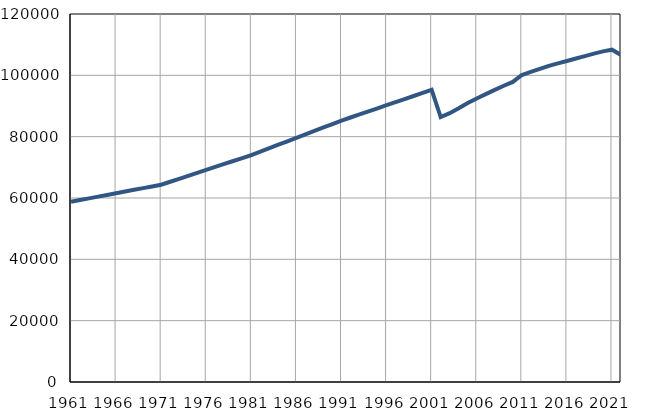
| Category | Population
size |
|---|---|
| 1961.0 | 58777 |
| 1962.0 | 59332 |
| 1963.0 | 59887 |
| 1964.0 | 60442 |
| 1965.0 | 60997 |
| 1966.0 | 61552 |
| 1967.0 | 62106 |
| 1968.0 | 62661 |
| 1969.0 | 63216 |
| 1970.0 | 63771 |
| 1971.0 | 64326 |
| 1972.0 | 65293 |
| 1973.0 | 66261 |
| 1974.0 | 67228 |
| 1975.0 | 68196 |
| 1976.0 | 69163 |
| 1977.0 | 70130 |
| 1978.0 | 71098 |
| 1979.0 | 72065 |
| 1980.0 | 73033 |
| 1981.0 | 74000 |
| 1982.0 | 75125 |
| 1983.0 | 76251 |
| 1984.0 | 77375 |
| 1985.0 | 78500 |
| 1986.0 | 79625 |
| 1987.0 | 80749 |
| 1988.0 | 81874 |
| 1989.0 | 82999 |
| 1990.0 | 84124 |
| 1991.0 | 85249 |
| 1992.0 | 86250 |
| 1993.0 | 87251 |
| 1994.0 | 88252 |
| 1995.0 | 89253 |
| 1996.0 | 90254 |
| 1997.0 | 91255 |
| 1998.0 | 92256 |
| 1999.0 | 93257 |
| 2000.0 | 94258 |
| 2001.0 | 95259 |
| 2002.0 | 86401 |
| 2003.0 | 87664 |
| 2004.0 | 89262 |
| 2005.0 | 90947 |
| 2006.0 | 92471 |
| 2007.0 | 93859 |
| 2008.0 | 95239 |
| 2009.0 | 96597 |
| 2010.0 | 97851 |
| 2011.0 | 100109 |
| 2012.0 | 101098 |
| 2013.0 | 102122 |
| 2014.0 | 103087 |
| 2015.0 | 103892 |
| 2016.0 | 104674 |
| 2017.0 | 105490 |
| 2018.0 | 106261 |
| 2019.0 | 107071 |
| 2020.0 | 107822 |
| 2021.0 | 108352 |
| 2022.0 | 106663 |